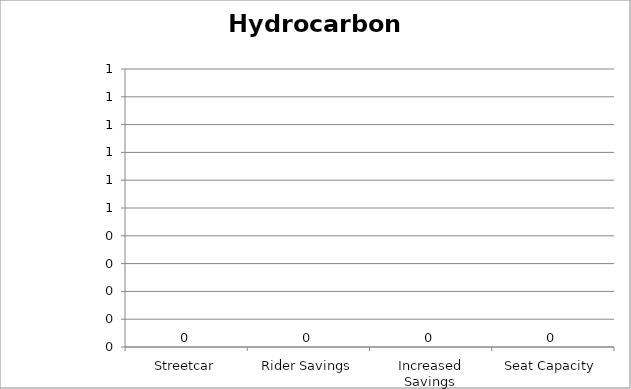
| Category | Hydrocarbons |
|---|---|
| Streetcar | 0 |
| Rider Savings | 0 |
| Increased Savings | 0 |
| Seat Capacity | 0 |